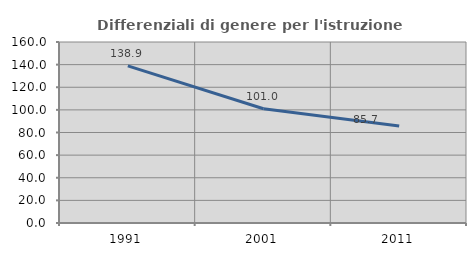
| Category | Differenziali di genere per l'istruzione superiore |
|---|---|
| 1991.0 | 138.935 |
| 2001.0 | 101.03 |
| 2011.0 | 85.651 |